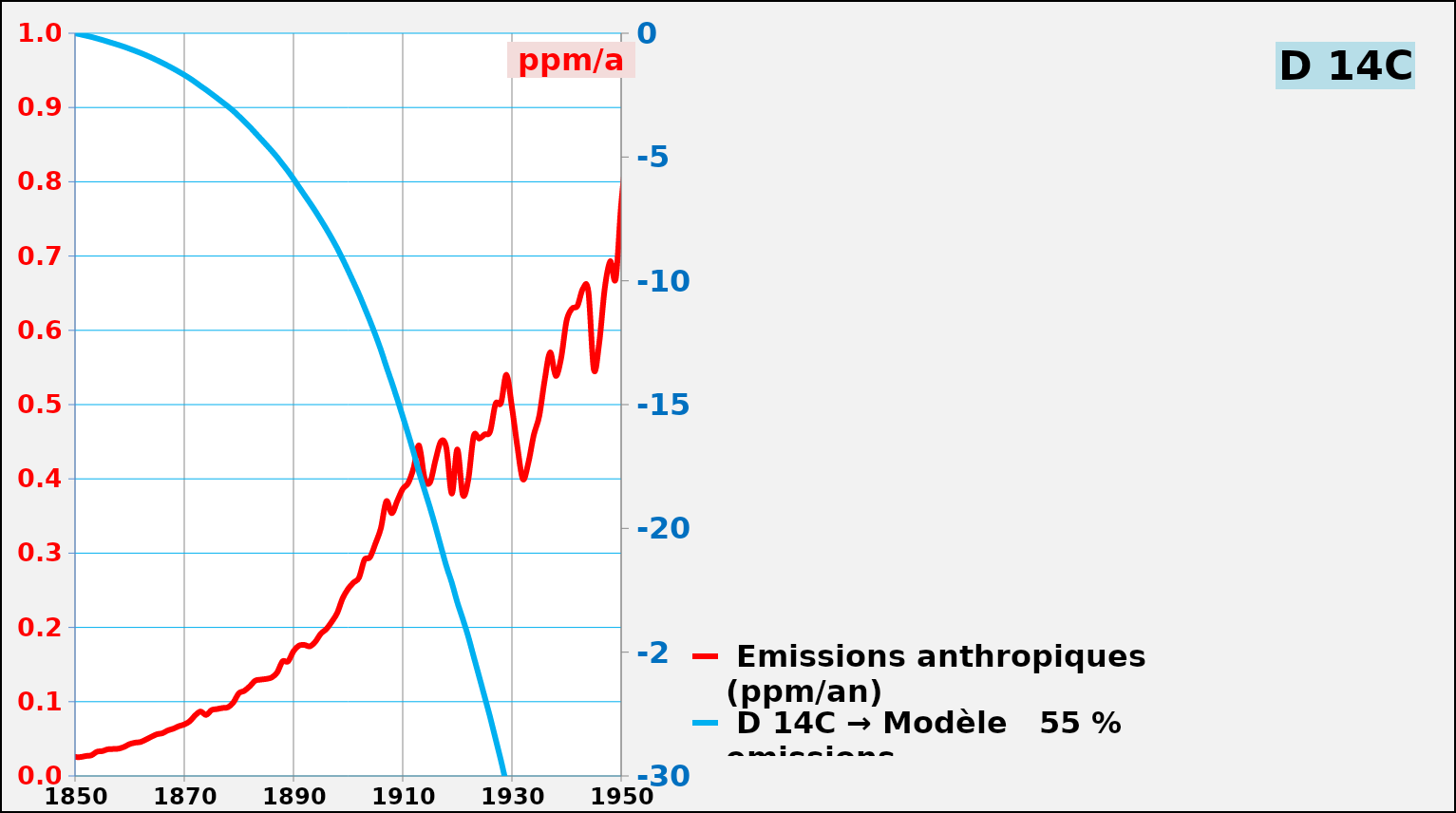
| Category |  Emissions anthropiques (ppm/an) |
|---|---|
| 1850.0 | 0.025 |
| 1851.0 | 0.025 |
| 1852.0 | 0.027 |
| 1853.0 | 0.028 |
| 1854.0 | 0.033 |
| 1855.0 | 0.033 |
| 1856.0 | 0.036 |
| 1857.0 | 0.036 |
| 1858.0 | 0.037 |
| 1859.0 | 0.039 |
| 1860.0 | 0.043 |
| 1861.0 | 0.045 |
| 1862.0 | 0.046 |
| 1863.0 | 0.049 |
| 1864.0 | 0.053 |
| 1865.0 | 0.056 |
| 1866.0 | 0.058 |
| 1867.0 | 0.061 |
| 1868.0 | 0.064 |
| 1869.0 | 0.067 |
| 1870.0 | 0.069 |
| 1871.0 | 0.074 |
| 1872.0 | 0.082 |
| 1873.0 | 0.087 |
| 1874.0 | 0.082 |
| 1875.0 | 0.089 |
| 1876.0 | 0.09 |
| 1877.0 | 0.092 |
| 1878.0 | 0.092 |
| 1879.0 | 0.099 |
| 1880.0 | 0.111 |
| 1881.0 | 0.115 |
| 1882.0 | 0.121 |
| 1883.0 | 0.128 |
| 1884.0 | 0.13 |
| 1885.0 | 0.131 |
| 1886.0 | 0.133 |
| 1887.0 | 0.139 |
| 1888.0 | 0.154 |
| 1889.0 | 0.154 |
| 1890.0 | 0.168 |
| 1891.0 | 0.175 |
| 1892.0 | 0.176 |
| 1893.0 | 0.175 |
| 1894.0 | 0.181 |
| 1895.0 | 0.192 |
| 1896.0 | 0.198 |
| 1897.0 | 0.208 |
| 1898.0 | 0.219 |
| 1899.0 | 0.239 |
| 1900.0 | 0.252 |
| 1901.0 | 0.26 |
| 1902.0 | 0.267 |
| 1903.0 | 0.291 |
| 1904.0 | 0.294 |
| 1905.0 | 0.313 |
| 1906.0 | 0.333 |
| 1907.0 | 0.37 |
| 1908.0 | 0.354 |
| 1909.0 | 0.37 |
| 1910.0 | 0.386 |
| 1911.0 | 0.394 |
| 1912.0 | 0.415 |
| 1913.0 | 0.445 |
| 1914.0 | 0.401 |
| 1915.0 | 0.395 |
| 1916.0 | 0.425 |
| 1917.0 | 0.45 |
| 1918.0 | 0.442 |
| 1919.0 | 0.38 |
| 1920.0 | 0.44 |
| 1921.0 | 0.379 |
| 1922.0 | 0.399 |
| 1923.0 | 0.458 |
| 1924.0 | 0.454 |
| 1925.0 | 0.46 |
| 1926.0 | 0.464 |
| 1927.0 | 0.501 |
| 1928.0 | 0.502 |
| 1929.0 | 0.54 |
| 1930.0 | 0.497 |
| 1931.0 | 0.443 |
| 1932.0 | 0.4 |
| 1933.0 | 0.421 |
| 1934.0 | 0.459 |
| 1935.0 | 0.484 |
| 1936.0 | 0.533 |
| 1937.0 | 0.57 |
| 1938.0 | 0.539 |
| 1939.0 | 0.562 |
| 1940.0 | 0.613 |
| 1941.0 | 0.629 |
| 1942.0 | 0.633 |
| 1943.0 | 0.656 |
| 1944.0 | 0.652 |
| 1945.0 | 0.547 |
| 1946.0 | 0.584 |
| 1947.0 | 0.657 |
| 1948.0 | 0.693 |
| 1949.0 | 0.669 |
| 1950.0 | 0.769 |
| 1951.0 | 0.833 |
| 1952.0 | 0.847 |